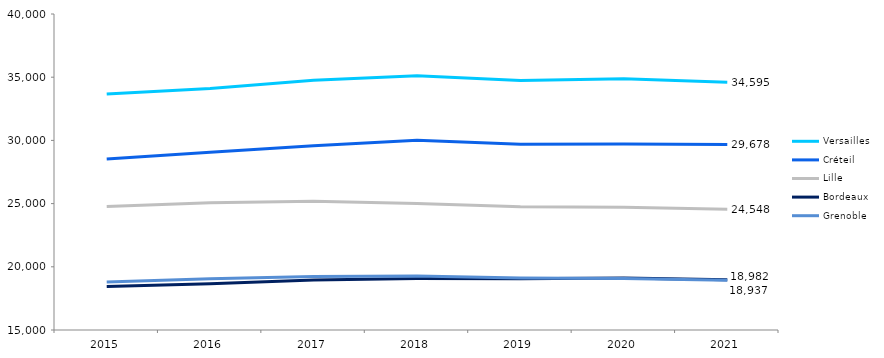
| Category | Versailles | Créteil | Lille | Bordeaux | Grenoble |
|---|---|---|---|---|---|
| 2015.0 | 33677 | 28522 | 24768 | 18435 | 18806 |
| 2016.0 | 34104 | 29058 | 25060 | 18661 | 19048 |
| 2017.0 | 34750 | 29575 | 25179 | 18962 | 19225 |
| 2018.0 | 35117 | 30018 | 25001 | 19081 | 19263 |
| 2019.0 | 34737 | 29698 | 24750 | 19045 | 19119 |
| 2020.0 | 34880 | 29722 | 24715 | 19107 | 19066 |
| 2021.0 | 34595 | 29678 | 24548 | 18982 | 18937 |